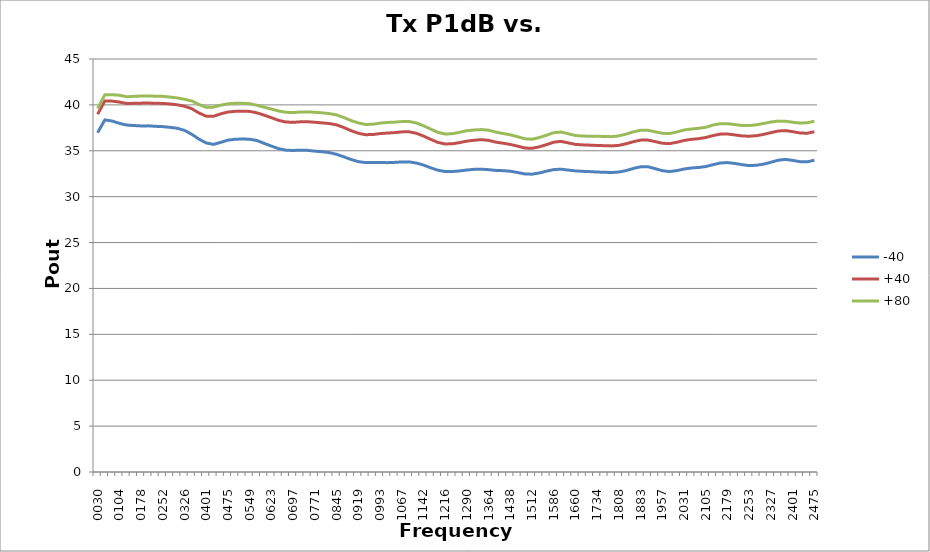
| Category | -40 | +40 | +80 |
|---|---|---|---|
| 30.0 | 36.97 | 38.982 | 39.62 |
| 54.7 | 38.368 | 40.43 | 41.093 |
| 79.4 | 38.24 | 40.41 | 41.107 |
| 104.10000000000001 | 37.992 | 40.31 | 41.055 |
| 128.8 | 37.804 | 40.145 | 40.884 |
| 153.5 | 37.752 | 40.173 | 40.931 |
| 178.2 | 37.708 | 40.19 | 40.965 |
| 202.89999999999998 | 37.715 | 40.204 | 40.98 |
| 227.59999999999997 | 37.665 | 40.173 | 40.94 |
| 252.29999999999995 | 37.63 | 40.159 | 40.929 |
| 276.99999999999994 | 37.555 | 40.1 | 40.853 |
| 301.69999999999993 | 37.453 | 40.013 | 40.759 |
| 326.3999999999999 | 37.222 | 39.851 | 40.612 |
| 351.0999999999999 | 36.798 | 39.59 | 40.426 |
| 375.7999999999999 | 36.266 | 39.117 | 40.042 |
| 400.4999999999999 | 35.852 | 38.765 | 39.731 |
| 425.1999999999999 | 35.697 | 38.752 | 39.755 |
| 449.89999999999986 | 35.915 | 39.023 | 39.97 |
| 474.59999999999985 | 36.161 | 39.223 | 40.111 |
| 499.29999999999984 | 36.256 | 39.298 | 40.18 |
| 523.9999999999999 | 36.281 | 39.302 | 40.175 |
| 548.6999999999999 | 36.26 | 39.292 | 40.132 |
| 573.4 | 36.118 | 39.134 | 39.96 |
| 598.1 | 35.806 | 38.882 | 39.747 |
| 622.8000000000001 | 35.512 | 38.603 | 39.546 |
| 647.5000000000001 | 35.227 | 38.313 | 39.334 |
| 672.2000000000002 | 35.07 | 38.138 | 39.194 |
| 696.9000000000002 | 35.03 | 38.099 | 39.166 |
| 721.6000000000003 | 35.072 | 38.155 | 39.225 |
| 746.3000000000003 | 35.045 | 38.164 | 39.239 |
| 771.0000000000003 | 34.962 | 38.106 | 39.195 |
| 795.7000000000004 | 34.894 | 38.04 | 39.131 |
| 820.4000000000004 | 34.808 | 37.97 | 39.055 |
| 845.1000000000005 | 34.612 | 37.823 | 38.908 |
| 869.8000000000005 | 34.343 | 37.538 | 38.626 |
| 894.5000000000006 | 34.055 | 37.191 | 38.295 |
| 919.2000000000006 | 33.816 | 36.911 | 38.038 |
| 943.9000000000007 | 33.715 | 36.754 | 37.868 |
| 968.6000000000007 | 33.719 | 36.771 | 37.887 |
| 993.3000000000008 | 33.721 | 36.873 | 38.013 |
| 1018.0000000000008 | 33.707 | 36.931 | 38.086 |
| 1042.7000000000007 | 33.734 | 36.979 | 38.117 |
| 1067.4000000000008 | 33.786 | 37.058 | 38.185 |
| 1092.1000000000008 | 33.791 | 37.069 | 38.19 |
| 1116.8000000000009 | 33.67 | 36.912 | 38.034 |
| 1141.500000000001 | 33.447 | 36.61 | 37.734 |
| 1166.200000000001 | 33.145 | 36.248 | 37.364 |
| 1190.900000000001 | 32.881 | 35.909 | 37.006 |
| 1215.600000000001 | 32.746 | 35.745 | 36.827 |
| 1240.300000000001 | 32.737 | 35.761 | 36.86 |
| 1265.0000000000011 | 32.805 | 35.893 | 37.014 |
| 1289.7000000000012 | 32.904 | 36.049 | 37.187 |
| 1314.4000000000012 | 32.978 | 36.148 | 37.267 |
| 1339.1000000000013 | 32.997 | 36.209 | 37.312 |
| 1363.8000000000013 | 32.943 | 36.136 | 37.242 |
| 1388.5000000000014 | 32.859 | 35.941 | 37.037 |
| 1413.2000000000014 | 32.834 | 35.826 | 36.88 |
| 1437.9000000000015 | 32.773 | 35.69 | 36.741 |
| 1462.6000000000015 | 32.632 | 35.508 | 36.533 |
| 1487.3000000000015 | 32.474 | 35.302 | 36.309 |
| 1512.0000000000016 | 32.449 | 35.267 | 36.258 |
| 1536.7000000000016 | 32.579 | 35.43 | 36.444 |
| 1561.4000000000017 | 32.778 | 35.668 | 36.696 |
| 1586.1000000000017 | 32.95 | 35.936 | 36.967 |
| 1610.8000000000018 | 32.993 | 36.026 | 37.041 |
| 1635.5000000000018 | 32.899 | 35.862 | 36.856 |
| 1660.2000000000019 | 32.807 | 35.696 | 36.663 |
| 1684.900000000002 | 32.76 | 35.645 | 36.603 |
| 1709.600000000002 | 32.729 | 35.612 | 36.587 |
| 1734.300000000002 | 32.683 | 35.581 | 36.582 |
| 1759.000000000002 | 32.656 | 35.554 | 36.557 |
| 1783.700000000002 | 32.634 | 35.531 | 36.537 |
| 1808.4000000000021 | 32.686 | 35.59 | 36.625 |
| 1833.1000000000022 | 32.841 | 35.765 | 36.822 |
| 1857.8000000000022 | 33.075 | 35.989 | 37.063 |
| 1882.5000000000023 | 33.255 | 36.16 | 37.241 |
| 1907.2000000000023 | 33.26 | 36.168 | 37.236 |
| 1931.9000000000024 | 33.051 | 36.002 | 37.068 |
| 1956.6000000000024 | 32.832 | 35.82 | 36.9 |
| 1981.3000000000025 | 32.734 | 35.78 | 36.874 |
| 2006.0000000000025 | 32.84 | 35.927 | 37.051 |
| 2030.7000000000025 | 33.009 | 36.126 | 37.267 |
| 2055.4000000000024 | 33.123 | 36.243 | 37.368 |
| 2080.100000000002 | 33.179 | 36.317 | 37.451 |
| 2104.800000000002 | 33.283 | 36.448 | 37.559 |
| 2129.500000000002 | 33.484 | 36.657 | 37.803 |
| 2154.2000000000016 | 33.667 | 36.814 | 37.951 |
| 2178.9000000000015 | 33.713 | 36.828 | 37.958 |
| 2203.6000000000013 | 33.618 | 36.729 | 37.859 |
| 2228.300000000001 | 33.487 | 36.621 | 37.758 |
| 2253.000000000001 | 33.38 | 36.583 | 37.743 |
| 2277.7000000000007 | 33.425 | 36.648 | 37.829 |
| 2302.4000000000005 | 33.545 | 36.789 | 37.978 |
| 2327.1000000000004 | 33.752 | 36.977 | 38.133 |
| 2351.8 | 33.973 | 37.151 | 38.232 |
| 2376.5 | 34.058 | 37.197 | 38.217 |
| 2401.2 | 33.953 | 37.088 | 38.111 |
| 2425.8999999999996 | 33.815 | 36.94 | 38.021 |
| 2450.5999999999995 | 33.792 | 36.91 | 38.052 |
| 2475.2999999999993 | 33.976 | 37.077 | 38.22 |